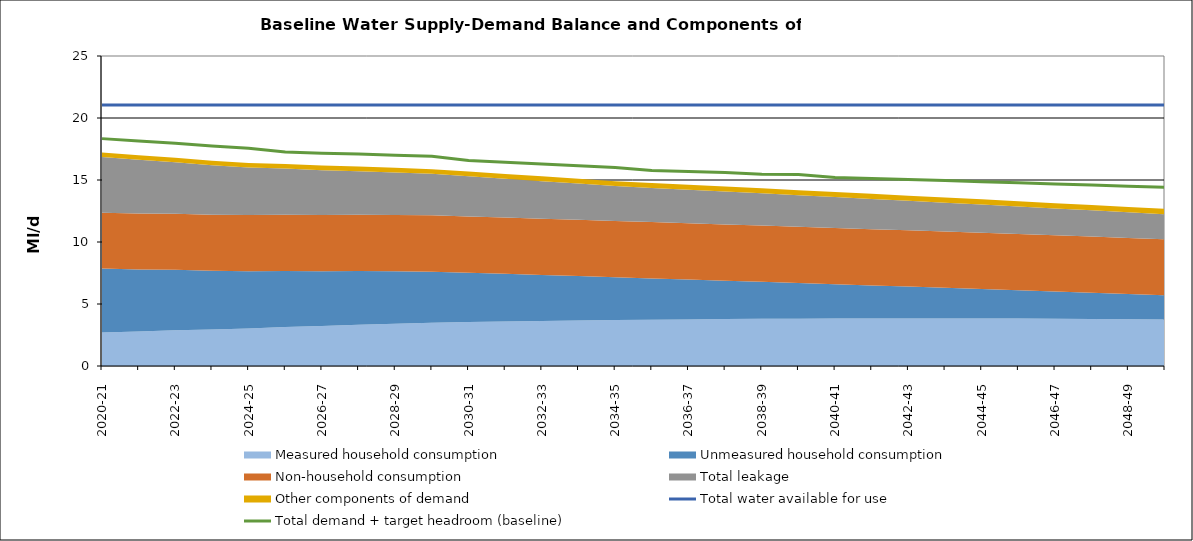
| Category | Total water available for use | Total demand + target headroom (baseline) |
|---|---|---|
| 0 | 21.047 | 18.336 |
| 1 | 21.047 | 18.138 |
| 2 | 21.047 | 17.962 |
| 3 | 21.047 | 17.734 |
| 4 | 21.047 | 17.566 |
| 5 | 21.047 | 17.262 |
| 6 | 21.047 | 17.155 |
| 7 | 21.047 | 17.091 |
| 8 | 21.047 | 16.999 |
| 9 | 21.047 | 16.908 |
| 10 | 21.047 | 16.567 |
| 11 | 21.047 | 16.434 |
| 12 | 21.047 | 16.285 |
| 13 | 21.047 | 16.146 |
| 14 | 21.047 | 16.011 |
| 15 | 21.047 | 15.773 |
| 16 | 21.047 | 15.691 |
| 17 | 21.047 | 15.602 |
| 18 | 21.047 | 15.471 |
| 19 | 21.047 | 15.442 |
| 20 | 21.047 | 15.209 |
| 21 | 21.047 | 15.123 |
| 22 | 21.047 | 15.045 |
| 23 | 21.047 | 14.956 |
| 24 | 21.047 | 14.859 |
| 25 | 21.047 | 14.778 |
| 26 | 21.047 | 14.682 |
| 27 | 21.047 | 14.595 |
| 28 | 21.047 | 14.502 |
| 29 | 21.047 | 14.413 |